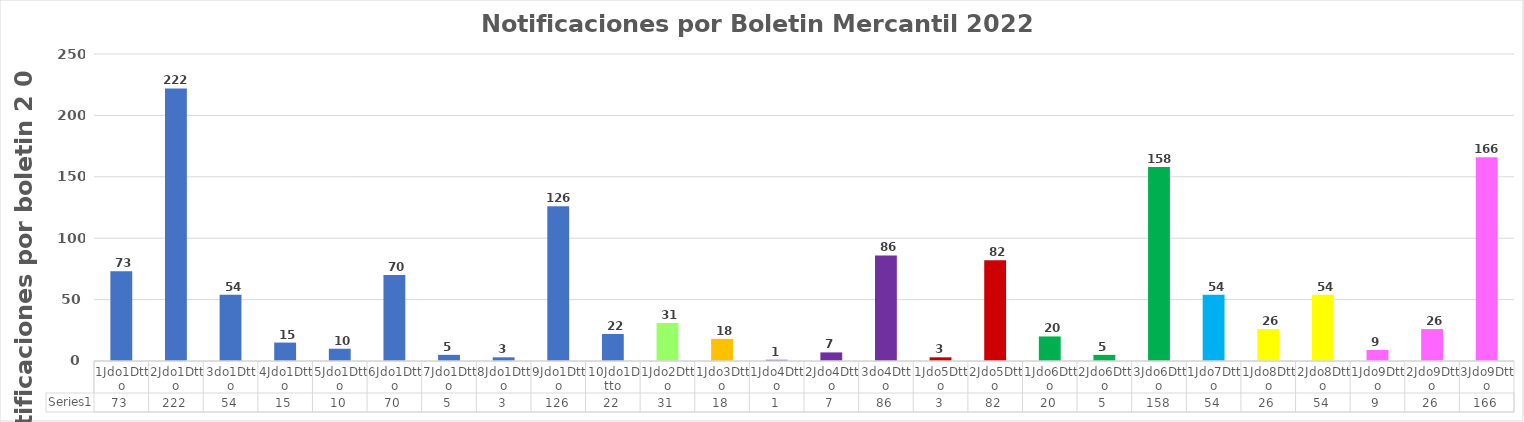
| Category | Series 0 |
|---|---|
| 1Jdo1Dtto | 73 |
| 2Jdo1Dtto | 222 |
| 3do1Dtto | 54 |
| 4Jdo1Dtto | 15 |
| 5Jdo1Dtto | 10 |
| 6Jdo1Dtto | 70 |
| 7Jdo1Dtto | 5 |
| 8Jdo1Dtto | 3 |
| 9Jdo1Dtto | 126 |
| 10Jdo1Dtto | 22 |
| 1Jdo2Dtto | 31 |
| 1Jdo3Dtto | 18 |
| 1Jdo4Dtto | 1 |
| 2Jdo4Dtto | 7 |
| 3do4Dtto | 86 |
| 1Jdo5Dtto | 3 |
| 2Jdo5Dtto | 82 |
| 1Jdo6Dtto | 20 |
| 2Jdo6Dtto | 5 |
| 3Jdo6Dtto | 158 |
| 1Jdo7Dtto | 54 |
| 1Jdo8Dtto | 26 |
| 2Jdo8Dtto | 54 |
| 1Jdo9Dtto | 9 |
| 2Jdo9Dtto | 26 |
| 3Jdo9Dtto | 166 |